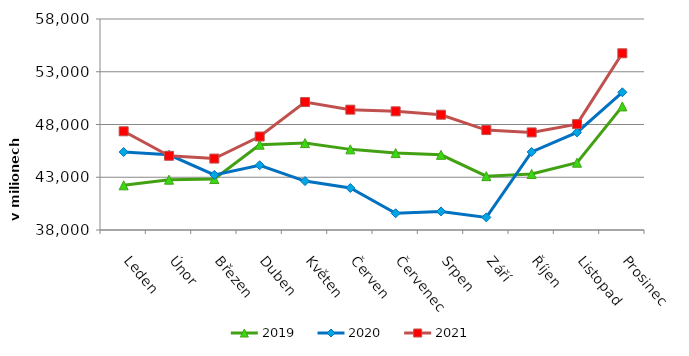
| Category | 2019 | 2020 | 2021 |
|---|---|---|---|
| Leden | 42234.71 | 45393.051 | 47356.114 |
| Únor | 42770.128 | 45129.78 | 45036.142 |
| Březen | 42828.279 | 43222.779 | 44769.404 |
| Duben  | 46086.365 | 44135.674 | 46859.485 |
| Květen | 46237.312 | 42636 | 50125.315 |
| Červen | 45642.782 | 41982.067 | 49404.932 |
| Červenec | 45288.983 | 39583.617 | 49248.499 |
| Srpen | 45124.307 | 39758.377 | 48927.934 |
| Září | 43102.388 | 39196.819 | 47470.49 |
| Říjen | 43311.273 | 45394.994 | 47249.297 |
| Listopad | 44379.157 | 47251.866 | 48034.567 |
| Prosinec | 49716.159 | 51053.874 | 54750.412 |